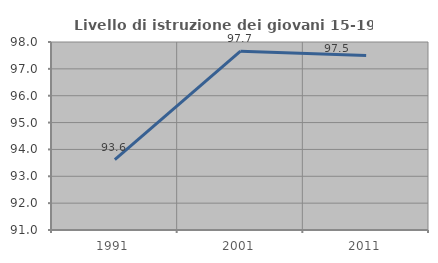
| Category | Livello di istruzione dei giovani 15-19 anni |
|---|---|
| 1991.0 | 93.617 |
| 2001.0 | 97.656 |
| 2011.0 | 97.5 |